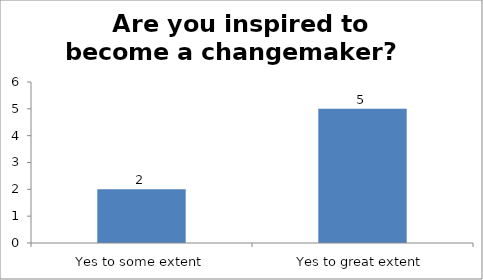
| Category | Are you inspired to become a changemaker?   |
|---|---|
| Yes to some extent | 2 |
| Yes to great extent | 5 |